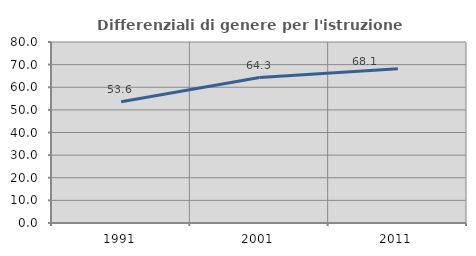
| Category | Differenziali di genere per l'istruzione superiore |
|---|---|
| 1991.0 | 53.603 |
| 2001.0 | 64.27 |
| 2011.0 | 68.134 |